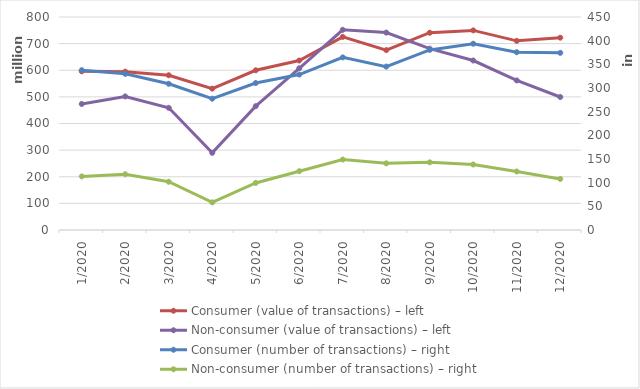
| Category | Consumer (value of transactions) – left | Non-consumer (value of transactions) – left |
|---|---|---|
| 1/2020 | 596017392 | 473326258 |
| 2/2020 | 594774497 | 501661899 |
| 3/2020 | 581245192 | 458876602 |
| 4/2020 | 530914666 | 289885239 |
| 5/2020 | 599845225 | 465156163 |
| 6/2020 | 636561358 | 607348792 |
| 7/2020 | 725323748 | 751859678 |
| 8/2020 | 675737554 | 741510550 |
| 9/2020 | 740952089 | 680996394 |
| 10/2020 | 749690535 | 636568684 |
| 11/2020 | 710425484 | 561721693 |
| 12/2020 | 722320135 | 499503032 |